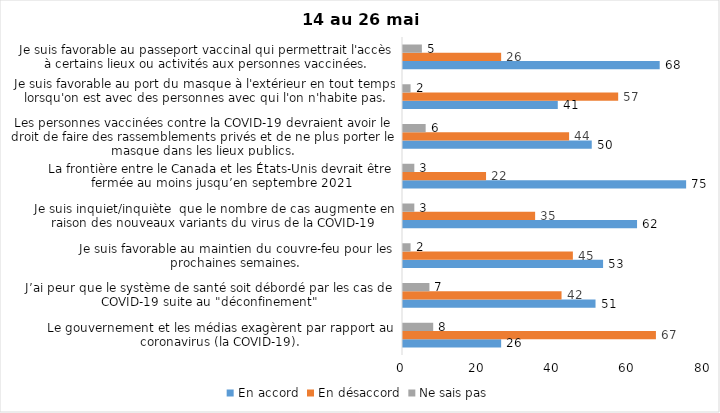
| Category | En accord | En désaccord | Ne sais pas |
|---|---|---|---|
| Le gouvernement et les médias exagèrent par rapport au coronavirus (la COVID-19). | 26 | 67 | 8 |
| J’ai peur que le système de santé soit débordé par les cas de COVID-19 suite au "déconfinement" | 51 | 42 | 7 |
| Je suis favorable au maintien du couvre-feu pour les prochaines semaines. | 53 | 45 | 2 |
| Je suis inquiet/inquiète  que le nombre de cas augmente en raison des nouveaux variants du virus de la COVID-19 | 62 | 35 | 3 |
| La frontière entre le Canada et les États-Unis devrait être fermée au moins jusqu’en septembre 2021 | 75 | 22 | 3 |
| Les personnes vaccinées contre la COVID-19 devraient avoir le droit de faire des rassemblements privés et de ne plus porter le masque dans les lieux publics. | 50 | 44 | 6 |
| Je suis favorable au port du masque à l'extérieur en tout temps lorsqu'on est avec des personnes avec qui l'on n'habite pas. | 41 | 57 | 2 |
| Je suis favorable au passeport vaccinal qui permettrait l'accès à certains lieux ou activités aux personnes vaccinées. | 68 | 26 | 5 |